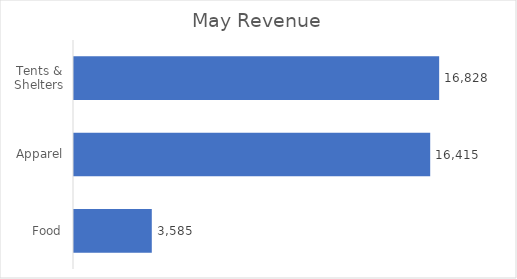
| Category | May |
|---|---|
| Food | 3585 |
| Apparel | 16415 |
| Tents & Shelters | 16828 |